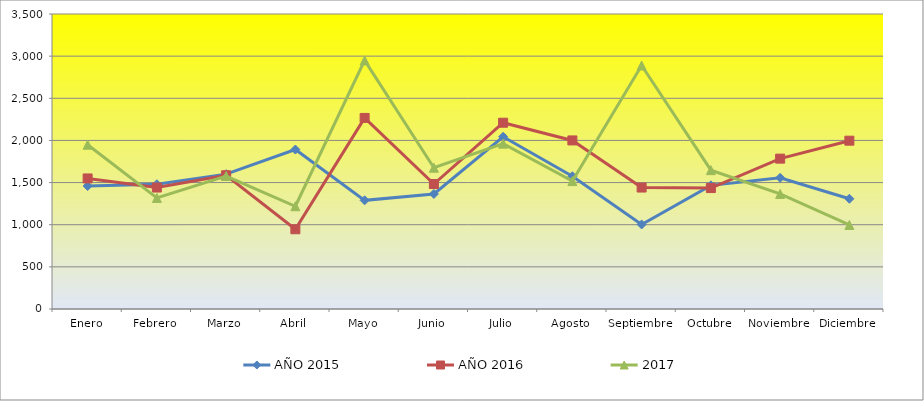
| Category | AÑO 2015 | AÑO 2016 | 2017 |
|---|---|---|---|
| Enero | 1459 | 1549 | 1949.206 |
| Febrero | 1480 | 1441 | 1317.46 |
| Marzo | 1600 | 1587 | 1577.778 |
| Abril | 1892 | 946 | 1219.048 |
| Mayo | 1289 | 2267 | 2949.206 |
| Junio | 1365 | 1483 | 1676.19 |
| Julio | 2044 | 2210 | 1961.905 |
| Agosto | 1575 | 2000 | 1517.46 |
| Septiembre | 1003 | 1441 | 2888.889 |
| Octubre | 1467 | 1435 | 1647.619 |
| Noviembre | 1556 | 1784 | 1365.079 |
| Diciembre | 1308 | 1997 | 996.825 |